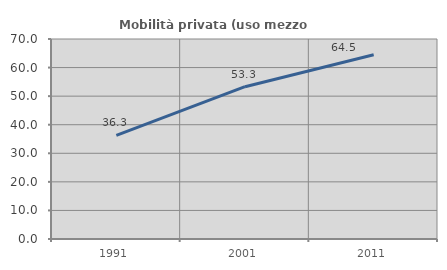
| Category | Mobilità privata (uso mezzo privato) |
|---|---|
| 1991.0 | 36.274 |
| 2001.0 | 53.312 |
| 2011.0 | 64.473 |